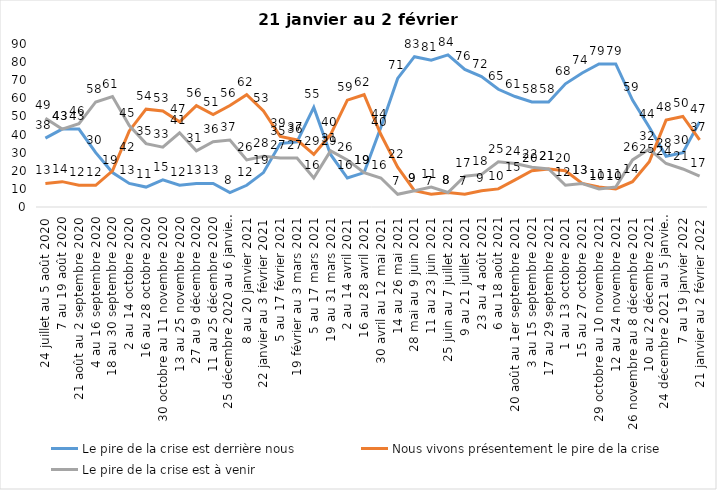
| Category | Le pire de la crise est derrière nous | Nous vivons présentement le pire de la crise | Le pire de la crise est à venir |
|---|---|---|---|
| 24 juillet au 5 août 2020 | 38 | 13 | 49 |
| 7 au 19 août 2020 | 43 | 14 | 43 |
| 21 août au 2 septembre 2020 | 43 | 12 | 46 |
| 4 au 16 septembre 2020 | 30 | 12 | 58 |
| 18 au 30 septembre 2020 | 19 | 20 | 61 |
| 2 au 14 octobre 2020 | 13 | 42 | 45 |
| 16 au 28 octobre 2020 | 11 | 54 | 35 |
| 30 octobre au 11 novembre 2020 | 15 | 53 | 33 |
| 13 au 25 novembre 2020 | 12 | 47 | 41 |
| 27 au 9 décembre 2020 | 13 | 56 | 31 |
| 11 au 25 décembre 2020 | 13 | 51 | 36 |
| 25 décembre 2020 au 6 janvier 2021 | 8 | 56 | 37 |
| 8 au 20 janvier 2021 | 12 | 62 | 26 |
| 22 janvier au 3 février 2021 | 19 | 53 | 28 |
| 5 au 17 février 2021 | 35 | 39 | 27 |
| 19 février au 3 mars 2021 | 36 | 37 | 27 |
| 5 au 17 mars 2021 | 55 | 29 | 16 |
| 19 au 31 mars 2021 | 29 | 40 | 31 |
| 2 au 14 avril 2021 | 16 | 59 | 26 |
| 16 au 28 avril 2021 | 19 | 62 | 19 |
| 30 avril au 12 mai 2021 | 44 | 40 | 16 |
| 14 au 26 mai 2021 | 71 | 22 | 7 |
| 28 mai au 9 juin 2021 | 83 | 9 | 9 |
| 11 au 23 juin 2021 | 81 | 7 | 11 |
| 25 juin au 7 juillet 2021 | 84 | 8 | 8 |
| 9 au 21 juillet 2021 | 76 | 7 | 17 |
| 23 au 4 août 2021 | 72 | 9 | 18 |
| 6 au 18 août 2021 | 65 | 10 | 25 |
| 20 août au 1er septembre 2021 | 61 | 15 | 24 |
| 3 au 15 septembre 2021 | 58 | 20 | 22 |
| 17 au 29 septembre 2021 | 58 | 21 | 21 |
| 1 au 13 octobre 2021 | 68 | 20 | 12 |
| 15 au 27 octobre 2021 | 74 | 13 | 13 |
| 29 octobre au 10 novembre 2021 | 79 | 11 | 10 |
| 12 au 24 novembre 2021 | 79 | 10 | 11 |
| 26 novembre au 8 décembre 2021 | 59 | 14 | 26 |
| 10 au 22 décembre 2021 | 44 | 25 | 32 |
| 24 décembre 2021 au 5 janvier 2022 | 28 | 48 | 24 |
| 7 au 19 janvier 2022 | 30 | 50 | 21 |
| 21 janvier au 2 février 2022 | 47 | 37 | 17 |